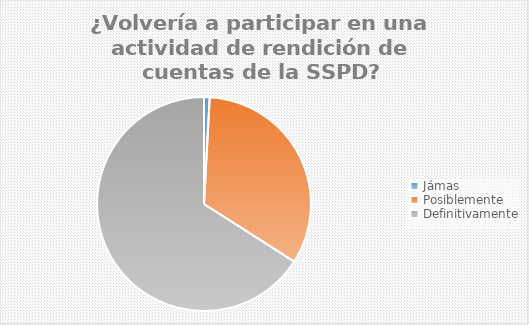
| Category | totales | porcentaje |
|---|---|---|
| Jámas | 2 | 0.009 |
| Posiblemente | 78 | 0.332 |
| Definitivamente | 155 | 0.66 |